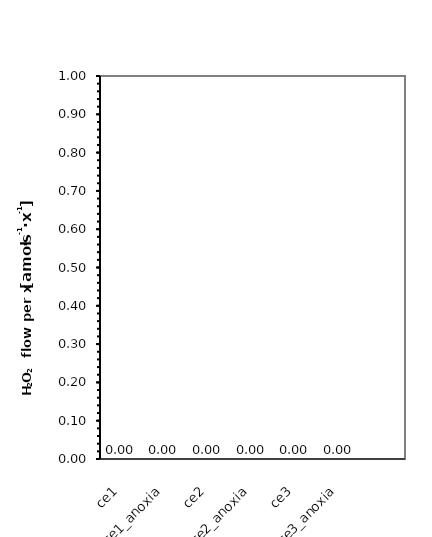
| Category | H2O2 flow per x |
|---|---|
| ce1 | 0 |
| ce1_anoxia | 0 |
| ce2 | 0 |
| ce2_anoxia | 0 |
| ce3 | 0 |
| ce3_anoxia | 0 |